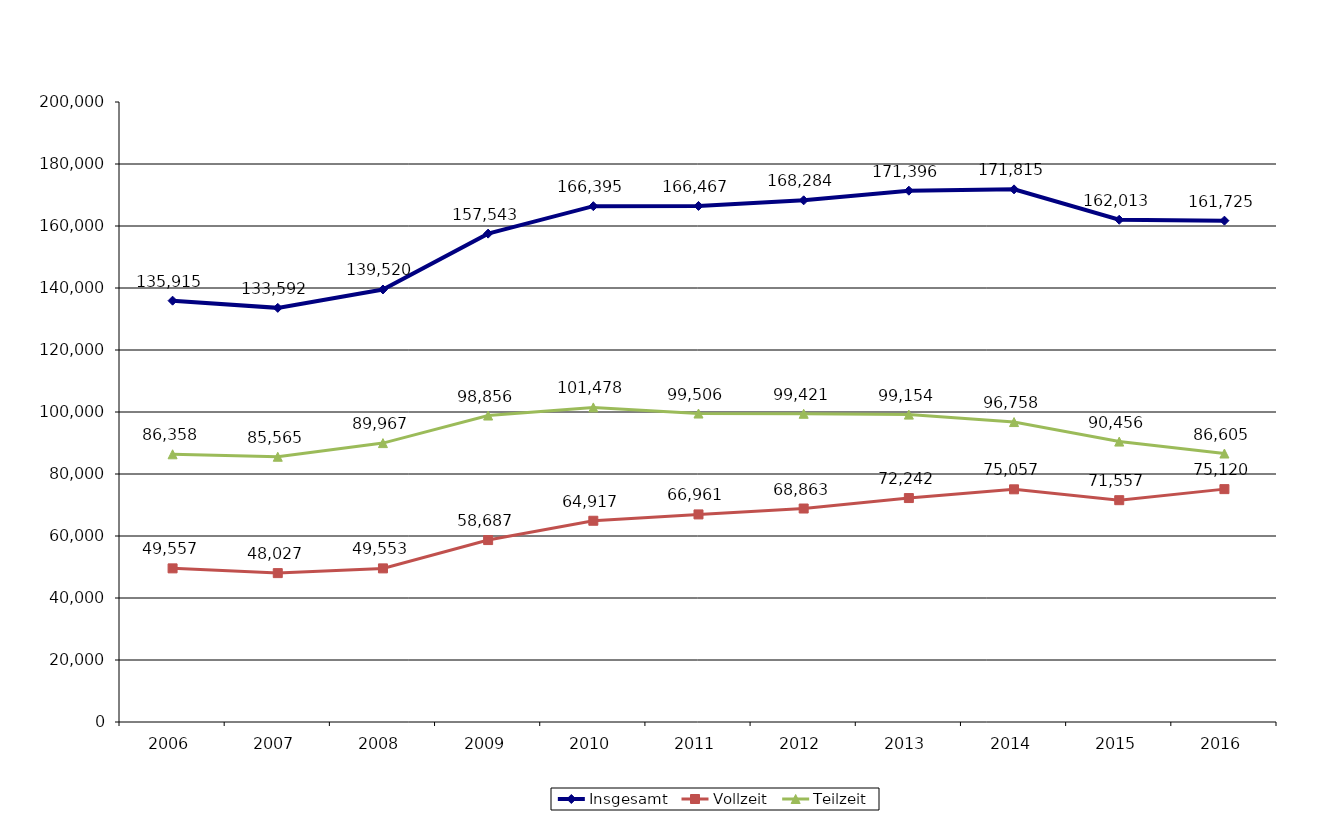
| Category | Insgesamt | Vollzeit | Teilzeit |
|---|---|---|---|
| 2006.0 | 135915 | 49557 | 86358 |
| 2007.0 | 133592 | 48027 | 85565 |
| 2008.0 | 139520 | 49553 | 89967 |
| 2009.0 | 157543 | 58687 | 98856 |
| 2010.0 | 166395 | 64917 | 101478 |
| 2011.0 | 166467 | 66961 | 99506 |
| 2012.0 | 168284 | 68863 | 99421 |
| 2013.0 | 171396 | 72242 | 99154 |
| 2014.0 | 171815 | 75057 | 96758 |
| 2015.0 | 162013 | 71557 | 90456 |
| 2016.0 | 161725 | 75120 | 86605 |